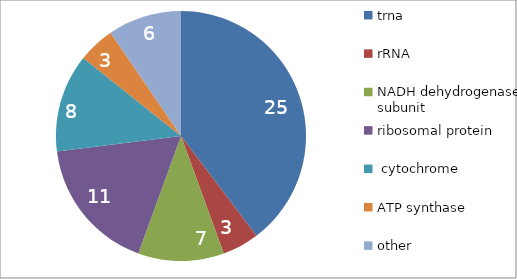
| Category | Series 0 |
|---|---|
| trna | 25 |
| rRNA | 3 |
| NADH dehydrogenase subunit | 7 |
| ribosomal protein | 11 |
|  cytochrome | 8 |
| ATP synthase | 3 |
| other | 6 |